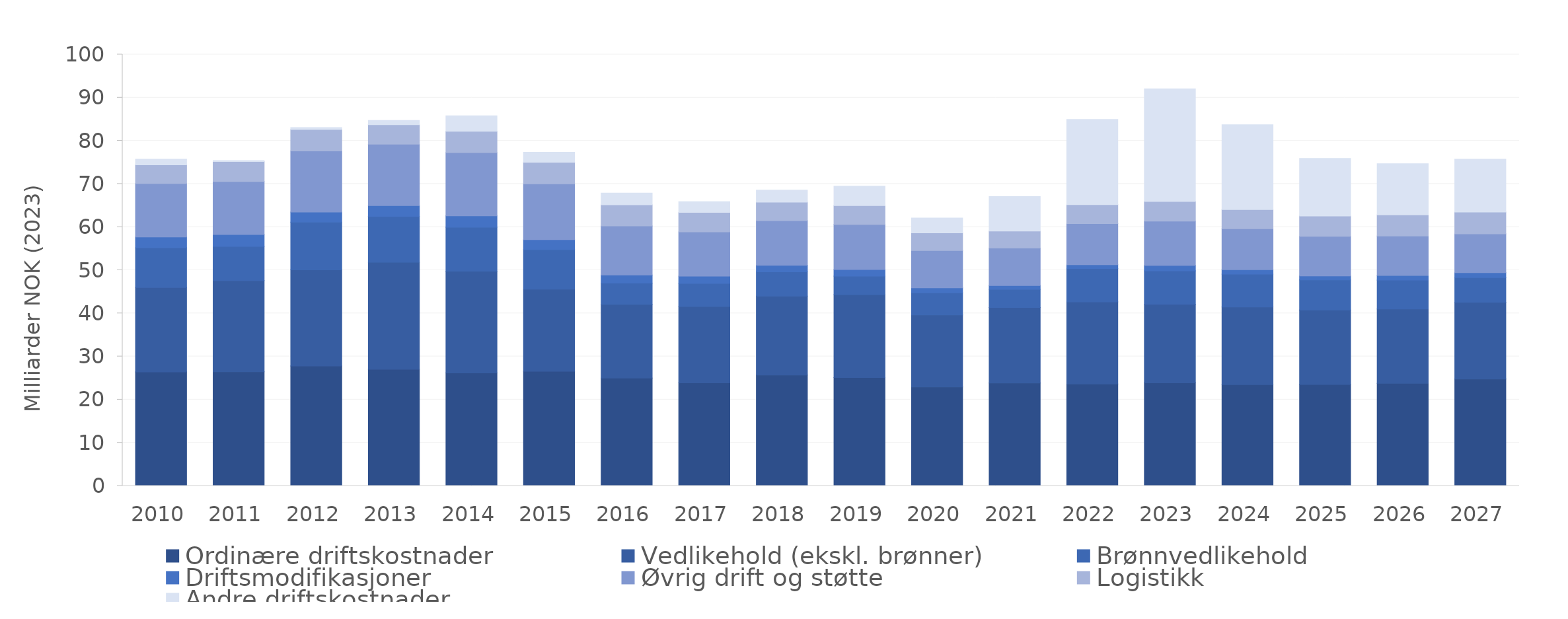
| Category | Ordinære driftskostnader | Vedlikehold (ekskl. brønner) | Brønnvedlikehold | Driftsmodifikasjoner | Øvrig drift og støtte | Logistikk | Andre driftskostnader |
|---|---|---|---|---|---|---|---|
| 2010.0 | 26.407 | 19.569 | 9.235 | 2.493 | 12.414 | 4.292 | 1.325 |
| 2011.0 | 26.45 | 21.141 | 7.905 | 2.791 | 12.267 | 4.636 | 0.232 |
| 2012.0 | 27.796 | 22.266 | 11.09 | 2.311 | 14.182 | 4.983 | 0.45 |
| 2013.0 | 27.039 | 24.782 | 10.643 | 2.5 | 14.234 | 4.544 | 0.965 |
| 2014.0 | 26.175 | 23.607 | 10.187 | 2.614 | 14.679 | 4.924 | 3.596 |
| 2015.0 | 26.553 | 19.035 | 9.195 | 2.291 | 12.952 | 4.984 | 2.334 |
| 2016.0 | 25.002 | 17.087 | 4.944 | 1.852 | 11.369 | 4.897 | 2.744 |
| 2017.0 | 23.904 | 17.675 | 5.363 | 1.662 | 10.285 | 4.504 | 2.492 |
| 2018.0 | 25.696 | 18.279 | 5.63 | 1.544 | 10.318 | 4.321 | 2.79 |
| 2019.0 | 25.127 | 19.199 | 4.31 | 1.504 | 10.473 | 4.354 | 4.521 |
| 2020.0 | 22.944 | 16.682 | 5.124 | 1.153 | 8.662 | 4.085 | 3.441 |
| 2021.0 | 23.836 | 17.513 | 4.214 | 0.891 | 8.663 | 3.953 | 8.009 |
| 2022.0 | 23.639 | 18.997 | 7.751 | 0.883 | 9.508 | 4.435 | 19.739 |
| 2023.0 | 23.896 | 18.233 | 7.714 | 1.279 | 10.263 | 4.531 | 26.136 |
| 2024.0 | 23.473 | 17.995 | 7.631 | 1.018 | 9.485 | 4.448 | 19.683 |
| 2025.0 | 23.504 | 17.259 | 6.959 | 0.943 | 9.199 | 4.706 | 13.338 |
| 2026.0 | 23.788 | 17.207 | 6.717 | 1.058 | 9.14 | 4.901 | 11.893 |
| 2027.0 | 24.768 | 17.818 | 5.703 | 1.123 | 9.01 | 5.059 | 12.257 |